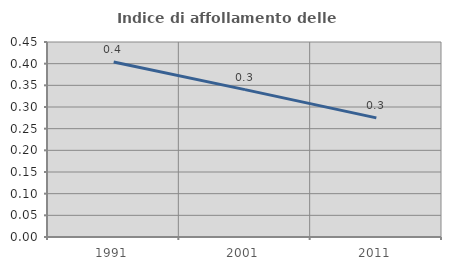
| Category | Indice di affollamento delle abitazioni  |
|---|---|
| 1991.0 | 0.404 |
| 2001.0 | 0.34 |
| 2011.0 | 0.275 |